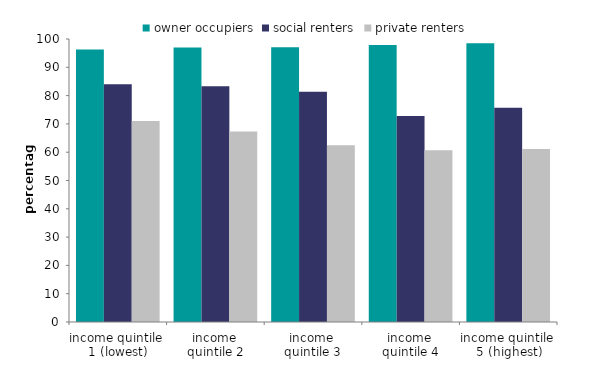
| Category | owner occupiers | social renters | private renters |
|---|---|---|---|
| income quintile 
1 (lowest) | 96.319 | 84.031 | 71.013 |
| income 
quintile 2 | 97.014 | 83.298 | 67.343 |
| income 
quintile 3 | 97.104 | 81.352 | 62.498 |
| income 
quintile 4 | 97.89 | 72.814 | 60.673 |
| income quintile 
5 (highest) | 98.486 | 75.721 | 61.123 |